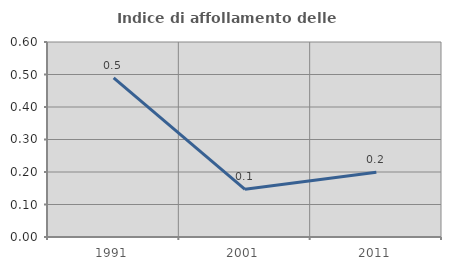
| Category | Indice di affollamento delle abitazioni  |
|---|---|
| 1991.0 | 0.49 |
| 2001.0 | 0.147 |
| 2011.0 | 0.199 |